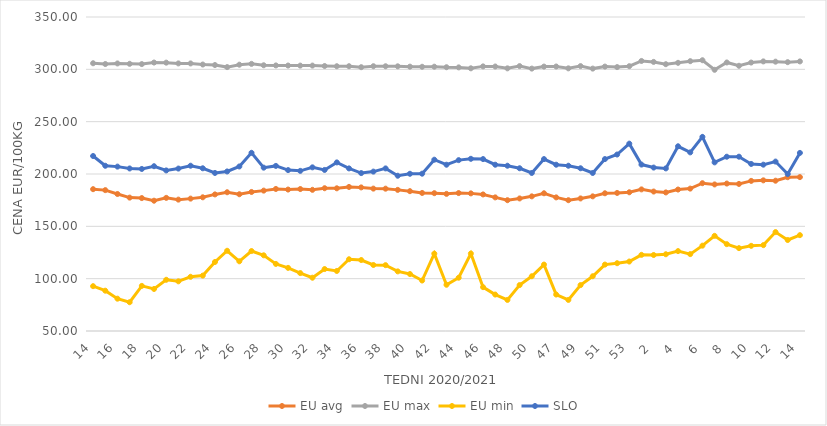
| Category | EU avg | EU max | EU min | SLO |
|---|---|---|---|---|
| 14.0 | 185.504 | 305.8 | 92.836 | 217.19 |
| 15.0 | 184.591 | 305.08 | 88.508 | 207.87 |
| 16.0 | 180.892 | 305.63 | 80.873 | 207.05 |
| 17.0 | 177.437 | 305.27 | 77.506 | 205.29 |
| 18.0 | 176.995 | 305.01 | 93.104 | 204.82 |
| 19.0 | 174.49 | 306.49 | 90.169 | 207.44 |
| 20.0 | 177.204 | 306.38 | 98.928 | 203.41 |
| 21.0 | 175.519 | 305.66 | 97.454 | 205.19 |
| 22.0 | 176.473 | 305.64 | 101.792 | 207.91 |
| 23.0 | 177.741 | 304.59 | 102.918 | 205.46 |
| 24.0 | 180.501 | 304.1 | 115.936 | 201 |
| 25.0 | 182.568 | 302.13 | 126.655 | 202.43 |
| 26.0 | 180.667 | 304.43 | 116.597 | 207.19 |
| 27.0 | 182.833 | 305.22 | 126.397 | 220.25 |
| 28.0 | 184.121 | 303.88 | 122.317 | 206.06 |
| 29.0 | 185.712 | 303.73 | 114.082 | 207.73 |
| 30.0 | 185.141 | 303.63 | 110.314 | 203.73 |
| 31.0 | 185.621 | 303.57 | 105.336 | 203 |
| 32.0 | 184.887 | 303.58 | 100.908 | 206.36 |
| 33.0 | 186.411 | 303.17 | 109.191 | 203.88 |
| 34.0 | 186.338 | 302.96 | 107.355 | 211.07 |
| 35.0 | 187.628 | 302.99 | 118.534 | 205.34 |
| 36.0 | 187.19 | 302.05 | 117.814 | 200.88 |
| 37.0 | 186.038 | 302.98 | 113.058 | 202.29 |
| 38.0 | 185.986 | 302.94 | 112.896 | 205.33 |
| 39.0 | 184.836 | 302.88 | 106.953 | 198.33 |
| 40.0 | 183.595 | 302.56 | 104.426 | 200.21 |
| 41.0 | 181.893 | 302.44 | 98.23 | 200.3 |
| 42.0 | 181.671 | 302.52 | 123.908 | 213.66 |
| 43.0 | 181.023 | 302.01 | 94.177 | 208.86 |
| 44.0 | 181.795 | 301.86 | 100.908 | 213.25 |
| 45.0 | 181.489 | 300.98 | 124 | 214.51 |
| 46.0 | 180.473 | 302.82 | 91.889 | 214.27 |
| 47.0 | 177.656 | 302.7 | 84.832 | 208.87 |
| 48.0 | 174.977 | 300.94 | 79.697 | 207.9 |
| 49.0 | 176.65 | 303.09 | 93.873 | 205.48 |
| 50.0 | 178.648 | 300.7 | 102.316 | 200.99 |
| 51.0 | 181.58 | 302.62 | 113.46 | 214.25 |
| 47.0 | 177.656 | 302.7 | 84.832 | 208.87 |
| 48.0 | 174.977 | 300.94 | 79.697 | 207.9 |
| 49.0 | 176.65 | 303.09 | 93.873 | 205.48 |
| 50.0 | 178.648 | 300.7 | 102.316 | 200.99 |
| 51.0 | 181.58 | 302.62 | 113.46 | 214.25 |
| 52.0 | 181.9 | 302.14 | 114.76 | 218.61 |
| 53.0 | 182.536 | 303 | 116.375 | 229 |
| 1.0 | 185.3 | 308 | 122.769 | 209 |
| 2.0 | 183.25 | 307.1 | 122.609 | 206.15 |
| 3.0 | 182.393 | 304.91 | 123.32 | 205.35 |
| 4.0 | 185.158 | 306.22 | 126.329 | 226.48 |
| 5.0 | 186.04 | 307.79 | 123.461 | 220.65 |
| 6.0 | 191.206 | 308.7 | 131.528 | 235.46 |
| 7.0 | 190.028 | 299.55 | 140.902 | 211.1 |
| 8.0 | 190.875 | 306.55 | 132.97 | 216.51 |
| 9.0 | 190.519 | 303.4 | 129.173 | 216.54 |
| 10.0 | 193.416 | 306.48 | 131.374 | 209.61 |
| 11.0 | 193.936 | 307.58 | 132.024 | 208.91 |
| 12.0 | 193.599 | 307.33 | 144.506 | 211.87 |
| 13.0 | 196.932 | 306.85 | 136.936 | 199.93 |
| 14.0 | 197.044 | 307.56 | 141.574 | 220.15 |